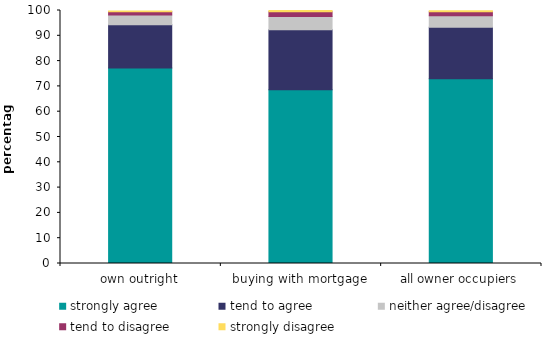
| Category | strongly agree | tend to agree | neither agree/disagree | tend to disagree | strongly disagree  |
|---|---|---|---|---|---|
| own outright | 77.3 | 17.083 | 3.807 | 1.277 | 0.352 |
| buying with mortgage | 68.718 | 23.699 | 5.203 | 1.84 | 0.492 |
| all owner occupiers | 73.001 | 20.397 | 4.507 | 1.559 | 0.422 |